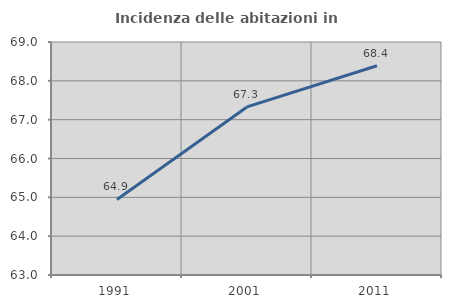
| Category | Incidenza delle abitazioni in proprietà  |
|---|---|
| 1991.0 | 64.945 |
| 2001.0 | 67.328 |
| 2011.0 | 68.388 |